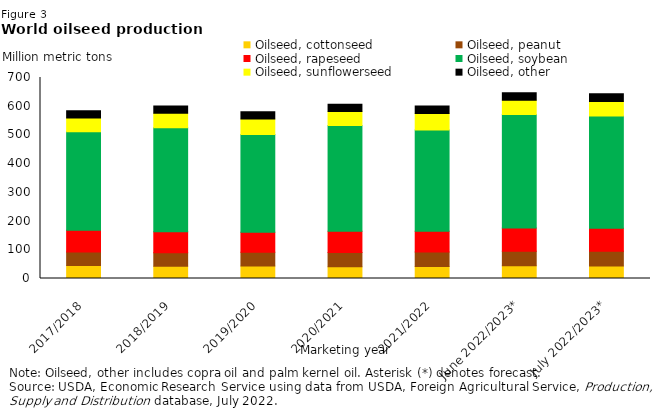
| Category | Oilseed, cottonseed | Oilseed, peanut | Oilseed, rapeseed | Oilseed, soybean | Oilseed, sunflowerseed | Oilseed, other |
|---|---|---|---|---|---|---|
| 2017/2018 | 45.252 | 47.1 | 75.283 | 343.737 | 48.01 | 24.463 |
| 2018/2019 | 42.97 | 46.621 | 72.853 | 362.443 | 50.659 | 25.28 |
| 2019/2020 | 43.547 | 48.06 | 69.598 | 340.152 | 54.2 | 25.018 |
| 2020/2021 | 40.806 | 50.174 | 73.465 | 368.126 | 49.249 | 24.623 |
| 2021/2022 | 41.893 | 50.31 | 72.096 | 352.744 | 57.379 | 25.91 |
| June 2022/2023* | 44.142 | 50.869 | 80.795 | 395.37 | 49.222 | 26.422 |
| July 2022/2023* | 43.781 | 50.857 | 80.23 | 391.396 | 50.384 | 26.422 |